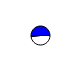
| Category | Series 0 |
|---|---|
| 0 | 13487 |
| 1 | 14513 |